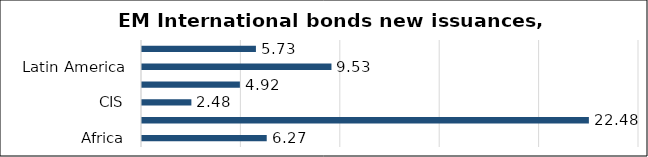
| Category | Series 0 |
|---|---|
| Africa | 6.274 |
| Asia | 22.479 |
| CIS | 2.484 |
| Eastern Europe | 4.924 |
| Latin America | 9.53 |
| Middle East | 5.731 |